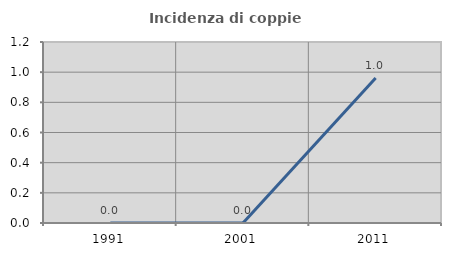
| Category | Incidenza di coppie miste |
|---|---|
| 1991.0 | 0 |
| 2001.0 | 0 |
| 2011.0 | 0.962 |